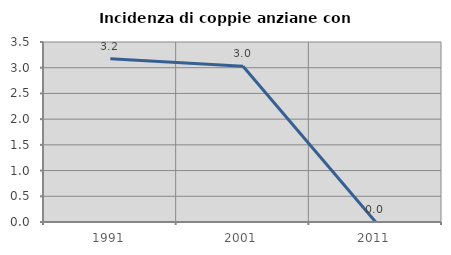
| Category | Incidenza di coppie anziane con figli |
|---|---|
| 1991.0 | 3.175 |
| 2001.0 | 3.03 |
| 2011.0 | 0 |